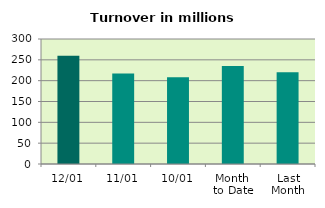
| Category | Series 0 |
|---|---|
| 12/01 | 259.544 |
| 11/01 | 217.182 |
| 10/01 | 208.227 |
| Month 
to Date | 235.289 |
| Last
Month | 219.947 |